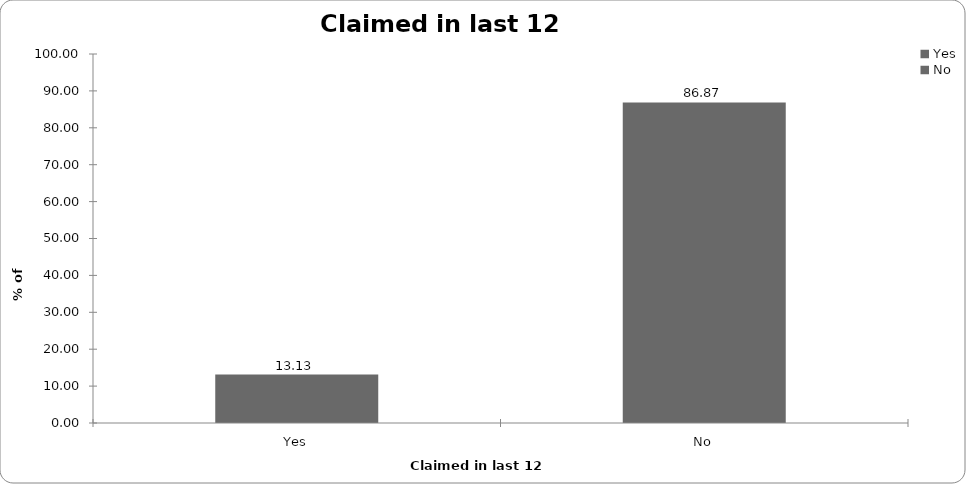
| Category | Claimed in last 12 months |
|---|---|
| Yes | 13.134 |
| No | 86.866 |